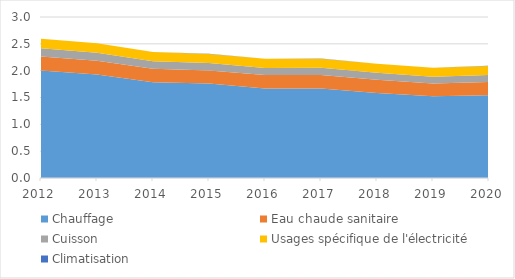
| Category | Chauffage | Eau chaude sanitaire | Cuisson | Usages spécifique de l'électricité | Climatisation |
|---|---|---|---|---|---|
| 2012.0 | 2.002 | 0.264 | 0.153 | 0.176 | 0.001 |
| 2013.0 | 1.931 | 0.255 | 0.146 | 0.18 | 0.001 |
| 2014.0 | 1.786 | 0.249 | 0.141 | 0.17 | 0.001 |
| 2015.0 | 1.761 | 0.242 | 0.139 | 0.17 | 0.001 |
| 2016.0 | 1.667 | 0.251 | 0.132 | 0.171 | 0.002 |
| 2017.0 | 1.666 | 0.254 | 0.133 | 0.17 | 0.002 |
| 2018.0 | 1.584 | 0.247 | 0.13 | 0.167 | 0.002 |
| 2019.0 | 1.521 | 0.241 | 0.126 | 0.164 | 0.003 |
| 2020.0 | 1.544 | 0.246 | 0.13 | 0.167 | 0.003 |